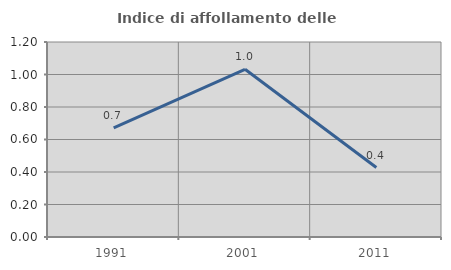
| Category | Indice di affollamento delle abitazioni  |
|---|---|
| 1991.0 | 0.671 |
| 2001.0 | 1.032 |
| 2011.0 | 0.427 |